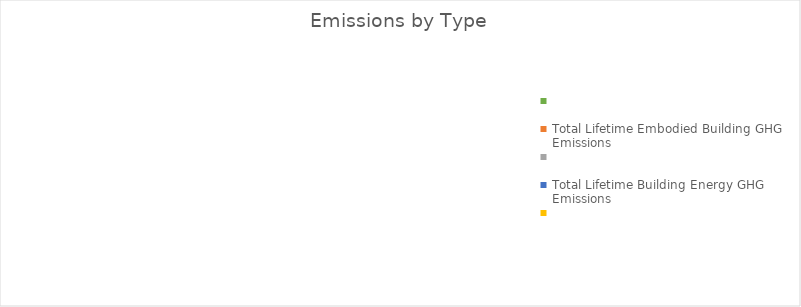
| Category | MT CO2e |
|---|---|
| Total Lifetime Embodied Building GHG Emissions | 0 |
| Total Lifetime Building Energy GHG Emissions | 0 |
| Total Lifetime Building Waste GHG Emissions | 0 |
| Total Lifetime Transportation GHG Emissions | 0 |
| Land Cover & Management Ecosystem Carbon Stock | 0 |